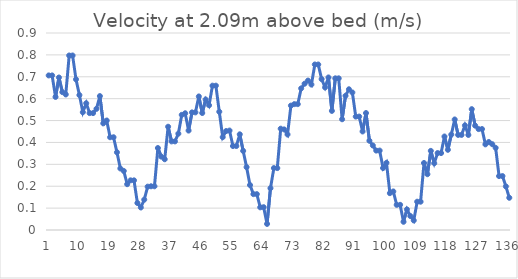
| Category | Velocity at 2.09m above bed (m/s) |
|---|---|
| 0 | 0.706 |
| 1 | 0.706 |
| 2 | 0.608 |
| 3 | 0.697 |
| 4 | 0.63 |
| 5 | 0.619 |
| 6 | 0.797 |
| 7 | 0.797 |
| 8 | 0.688 |
| 9 | 0.616 |
| 10 | 0.538 |
| 11 | 0.579 |
| 12 | 0.534 |
| 13 | 0.534 |
| 14 | 0.554 |
| 15 | 0.612 |
| 16 | 0.487 |
| 17 | 0.5 |
| 18 | 0.424 |
| 19 | 0.424 |
| 20 | 0.355 |
| 21 | 0.281 |
| 22 | 0.27 |
| 23 | 0.209 |
| 24 | 0.227 |
| 25 | 0.227 |
| 26 | 0.123 |
| 27 | 0.103 |
| 28 | 0.139 |
| 29 | 0.198 |
| 30 | 0.2 |
| 31 | 0.2 |
| 32 | 0.375 |
| 33 | 0.335 |
| 34 | 0.323 |
| 35 | 0.472 |
| 36 | 0.405 |
| 37 | 0.405 |
| 38 | 0.44 |
| 39 | 0.526 |
| 40 | 0.533 |
| 41 | 0.454 |
| 42 | 0.537 |
| 43 | 0.537 |
| 44 | 0.61 |
| 45 | 0.534 |
| 46 | 0.596 |
| 47 | 0.57 |
| 48 | 0.659 |
| 49 | 0.659 |
| 50 | 0.54 |
| 51 | 0.424 |
| 52 | 0.452 |
| 53 | 0.454 |
| 54 | 0.384 |
| 55 | 0.384 |
| 56 | 0.437 |
| 57 | 0.361 |
| 58 | 0.287 |
| 59 | 0.205 |
| 60 | 0.164 |
| 61 | 0.164 |
| 62 | 0.104 |
| 63 | 0.104 |
| 64 | 0.028 |
| 65 | 0.191 |
| 66 | 0.283 |
| 67 | 0.283 |
| 68 | 0.463 |
| 69 | 0.46 |
| 70 | 0.436 |
| 71 | 0.568 |
| 72 | 0.575 |
| 73 | 0.575 |
| 74 | 0.647 |
| 75 | 0.668 |
| 76 | 0.683 |
| 77 | 0.665 |
| 78 | 0.756 |
| 79 | 0.756 |
| 80 | 0.689 |
| 81 | 0.651 |
| 82 | 0.697 |
| 83 | 0.544 |
| 84 | 0.693 |
| 85 | 0.693 |
| 86 | 0.506 |
| 87 | 0.613 |
| 88 | 0.643 |
| 89 | 0.628 |
| 90 | 0.518 |
| 91 | 0.518 |
| 92 | 0.45 |
| 93 | 0.534 |
| 94 | 0.408 |
| 95 | 0.386 |
| 96 | 0.363 |
| 97 | 0.363 |
| 98 | 0.283 |
| 99 | 0.307 |
| 100 | 0.168 |
| 101 | 0.176 |
| 102 | 0.115 |
| 103 | 0.115 |
| 104 | 0.037 |
| 105 | 0.094 |
| 106 | 0.064 |
| 107 | 0.044 |
| 108 | 0.129 |
| 109 | 0.129 |
| 110 | 0.306 |
| 111 | 0.255 |
| 112 | 0.361 |
| 113 | 0.305 |
| 114 | 0.351 |
| 115 | 0.351 |
| 116 | 0.427 |
| 117 | 0.366 |
| 118 | 0.436 |
| 119 | 0.505 |
| 120 | 0.434 |
| 121 | 0.434 |
| 122 | 0.478 |
| 123 | 0.434 |
| 124 | 0.552 |
| 125 | 0.477 |
| 126 | 0.461 |
| 127 | 0.461 |
| 128 | 0.391 |
| 129 | 0.402 |
| 130 | 0.392 |
| 131 | 0.375 |
| 132 | 0.246 |
| 133 | 0.246 |
| 134 | 0.199 |
| 135 | 0.147 |